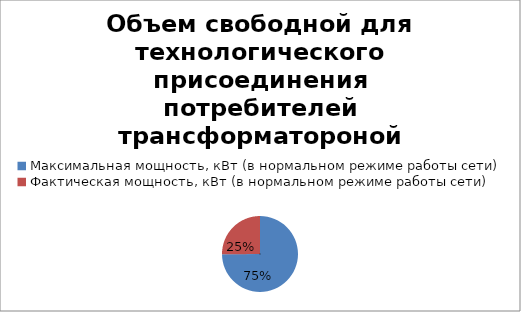
| Category | Объем свободной для технологического присоединения потребителей трансформатороной мощности  |
|---|---|
| Максимальная мощность, кВт (в нормальном режиме работы сети) | 211032 |
| Фактическая мощность, кВт (в нормальном режиме работы сети) | 70902 |